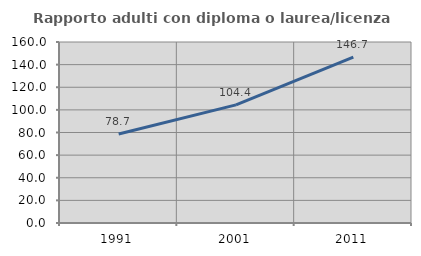
| Category | Rapporto adulti con diploma o laurea/licenza media  |
|---|---|
| 1991.0 | 78.696 |
| 2001.0 | 104.424 |
| 2011.0 | 146.682 |